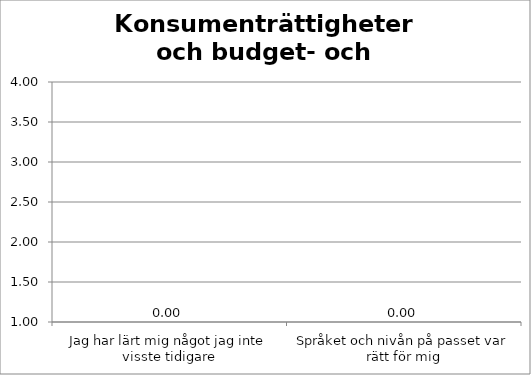
| Category | Sigtuna |
|---|---|
| Jag har lärt mig något jag inte visste tidigare | 0 |
| Språket och nivån på passet var rätt för mig | 0 |